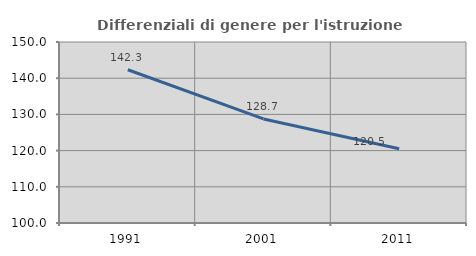
| Category | Differenziali di genere per l'istruzione superiore |
|---|---|
| 1991.0 | 142.336 |
| 2001.0 | 128.746 |
| 2011.0 | 120.518 |